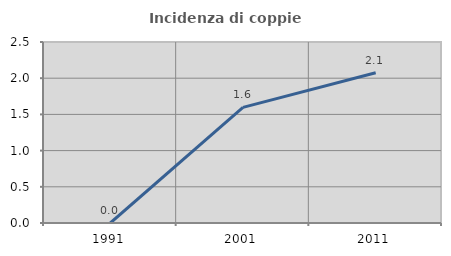
| Category | Incidenza di coppie miste |
|---|---|
| 1991.0 | 0 |
| 2001.0 | 1.597 |
| 2011.0 | 2.076 |